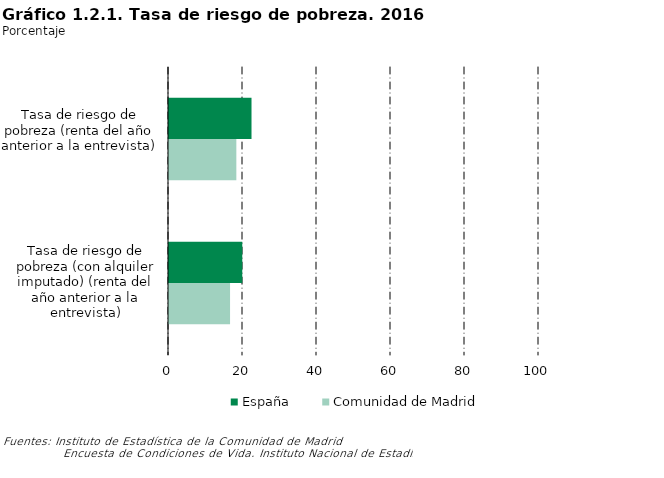
| Category | España | Comunidad de Madrid |
|---|---|---|
| Tasa de riesgo de pobreza (renta del año anterior a la entrevista) | 22.3 | 18.2 |
| Tasa de riesgo de pobreza (con alquiler imputado) (renta del año anterior a la entrevista) | 19.8 | 16.5 |